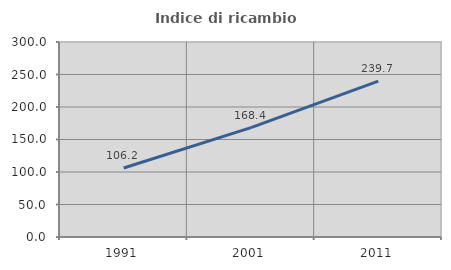
| Category | Indice di ricambio occupazionale  |
|---|---|
| 1991.0 | 106.193 |
| 2001.0 | 168.351 |
| 2011.0 | 239.672 |